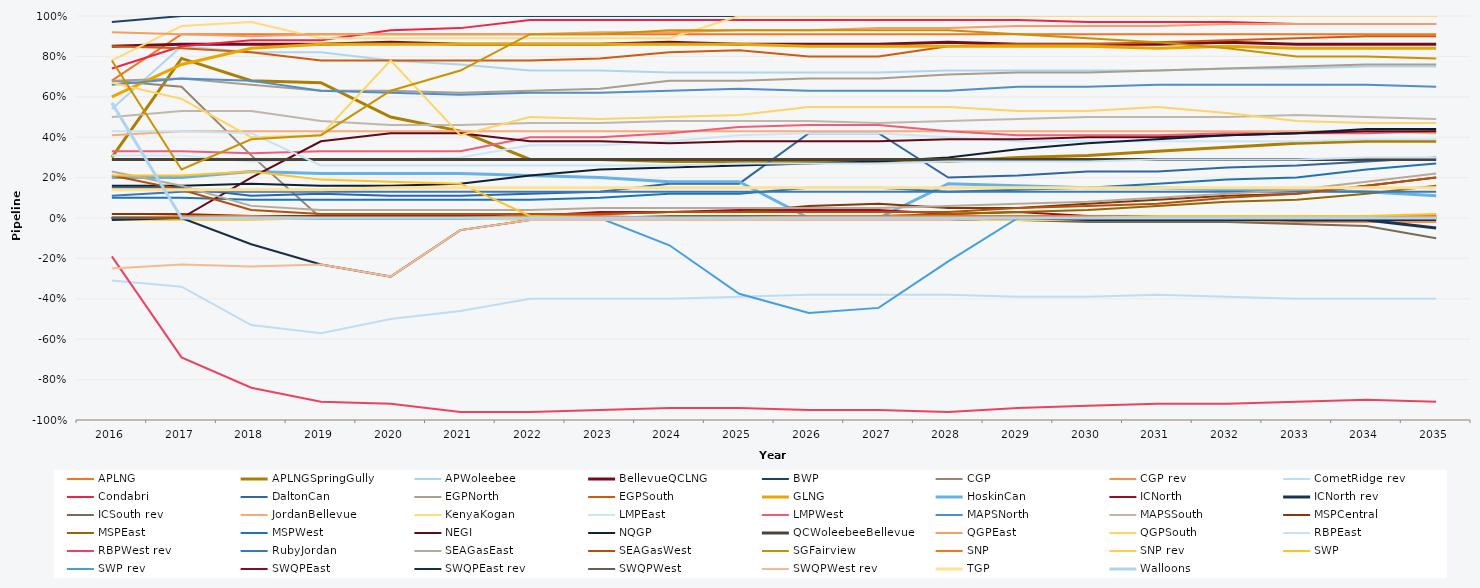
| Category | APLNG | APLNGSpringGully | APWoleebee | BellevueQCLNG | BWP | CGP | CGP rev | CometRidge rev | Condabri | DaltonCan | EGPNorth | EGPSouth | GLNG | HoskinCan | ICNorth | ICNorth rev | ICSouth rev | JordanBellevue | KenyaKogan | LMPEast | LMPWest | MAPSNorth | MAPSSouth | MSPCentral | MSPEast | MSPWest | NEGI | NQGP | QCWoleebeeBellevue | QGPEast | QGPSouth | RBPEast | RBPWest rev | RubyJordan | SEAGasEast | SEAGasWest | SGFairview | SNP | SNP rev | SWP | SWP rev | SWQPEast | SWQPEast rev | SWQPWest | SWQPWest rev | TGP | Walloons |
|---|---|---|---|---|---|---|---|---|---|---|---|---|---|---|---|---|---|---|---|---|---|---|---|---|---|---|---|---|---|---|---|---|---|---|---|---|---|---|---|---|---|---|---|---|---|---|---|
| 2016.0 | 0.68 | 0.3 | 0.54 | 0.85 | 0.97 | 0.68 | 0 | -0.31 | 0.74 | 0.15 | 0.68 | 0.85 | 0.6 | 0.2 | 0 | 0 | 0 | 0.41 | 0.78 | 0.31 | 0.33 | 0.66 | 0.5 | 0.02 | 0 | 0.1 | 0 | 0.16 | 0.29 | 0.92 | 0.67 | 0.43 | -0.19 | 0.11 | 0.23 | 0.21 | 0.78 | 0 | -0.01 | 0.21 | 0 | 0 | -0.01 | 0 | -0.25 | 0.14 | 0.57 |
| 2017.0 | 0.91 | 0.79 | 0.85 | 0.86 | 1 | 0.65 | 0 | -0.34 | 0.85 | 0.15 | 0.69 | 0.84 | 0.76 | 0.2 | 0 | 0 | 0 | 0.43 | 0.95 | 0.31 | 0.33 | 0.69 | 0.53 | 0.02 | 0 | 0.1 | 0 | 0.16 | 0.29 | 0.91 | 0.59 | 0.43 | -0.69 | 0.13 | 0.16 | 0.14 | 0.24 | 0.01 | -0.01 | 0.21 | 0 | 0 | 0 | 0 | -0.23 | 0.14 | 0 |
| 2018.0 | 0.91 | 0.68 | 0.82 | 0.86 | 1 | 0.31 | 0 | -0.53 | 0.88 | 0.11 | 0.66 | 0.82 | 0.84 | 0.23 | 0 | 0 | 0 | 0.43 | 0.97 | 0.28 | 0.32 | 0.68 | 0.53 | 0.01 | 0 | 0.09 | 0.2 | 0.17 | 0.29 | 0.9 | 0.4 | 0.42 | -0.84 | 0.13 | 0.06 | 0.04 | 0.39 | 0.01 | -0.01 | 0.23 | 0 | 0 | -0.13 | 0 | -0.24 | 0.14 | 0 |
| 2019.0 | 0.91 | 0.67 | 0.82 | 0.86 | 1 | 0 | 0 | -0.57 | 0.88 | 0.12 | 0.63 | 0.78 | 0.86 | 0.22 | 0 | 0 | 0 | 0.43 | 0.89 | 0.29 | 0.33 | 0.63 | 0.48 | 0.01 | 0 | 0.09 | 0.38 | 0.16 | 0.29 | 0.91 | 0.41 | 0.26 | -0.91 | 0.13 | 0.04 | 0.02 | 0.41 | 0 | 0 | 0.19 | 0 | 0 | -0.23 | 0 | -0.23 | 0.14 | 0 |
| 2020.0 | 0.91 | 0.5 | 0.78 | 0.87 | 1 | 0 | 0 | -0.5 | 0.93 | 0.11 | 0.63 | 0.78 | 0.86 | 0.22 | 0 | 0 | 0 | 0.43 | 0.89 | 0.29 | 0.33 | 0.62 | 0.46 | 0.01 | 0 | 0.09 | 0.42 | 0.16 | 0.29 | 0.91 | 0.78 | 0.26 | -0.92 | 0.13 | 0.04 | 0.02 | 0.63 | 0 | 0 | 0.18 | 0 | 0 | -0.29 | 0 | -0.29 | 0.15 | 0 |
| 2021.0 | 0.91 | 0.43 | 0.76 | 0.86 | 1 | 0 | 0 | -0.46 | 0.94 | 0.11 | 0.62 | 0.78 | 0.86 | 0.22 | 0 | 0 | 0 | 0.43 | 0.89 | 0.3 | 0.33 | 0.61 | 0.46 | 0.01 | 0 | 0.09 | 0.42 | 0.17 | 0.29 | 0.91 | 0.41 | 0.26 | -0.96 | 0.13 | 0.04 | 0.02 | 0.73 | 0 | 0 | 0.17 | 0 | 0 | -0.06 | 0 | -0.06 | 0.15 | 0 |
| 2022.0 | 0.91 | 0.29 | 0.73 | 0.86 | 1 | 0 | 0 | -0.4 | 0.98 | 0.12 | 0.63 | 0.78 | 0.86 | 0.21 | 0.01 | 0 | 0 | 0.43 | 0.89 | 0.36 | 0.4 | 0.62 | 0.47 | 0.02 | 0 | 0.09 | 0.38 | 0.21 | 0.29 | 0.91 | 0.5 | 0.26 | -0.96 | 0.13 | 0.04 | 0.02 | 0.91 | 0.01 | -0.01 | 0.01 | 0 | 0 | -0.01 | 0 | -0.01 | 0.15 | 0 |
| 2023.0 | 0.91 | 0.29 | 0.73 | 0.86 | 1 | 0 | 0 | -0.4 | 0.98 | 0.13 | 0.64 | 0.79 | 0.86 | 0.2 | 0.03 | 0 | 0 | 0.43 | 0.89 | 0.36 | 0.4 | 0.62 | 0.47 | 0.02 | 0 | 0.1 | 0.38 | 0.24 | 0.29 | 0.92 | 0.49 | 0.26 | -0.95 | 0.13 | 0.05 | 0.02 | 0.91 | 0.01 | -0.01 | 0 | 0 | 0 | -0.01 | 0 | -0.01 | 0.15 | 0 |
| 2024.0 | 0.91 | 0.28 | 0.72 | 0.87 | 1 | 0 | 0 | -0.4 | 0.98 | 0.17 | 0.68 | 0.82 | 0.86 | 0.18 | 0.03 | 0 | 0 | 0.43 | 0.89 | 0.38 | 0.42 | 0.63 | 0.48 | 0.03 | 0.01 | 0.12 | 0.37 | 0.25 | 0.29 | 0.92 | 0.5 | 0.26 | -0.94 | 0.13 | 0.05 | 0.03 | 0.93 | 0 | 0 | 0 | -0.135 | 0 | -0.01 | 0 | -0.01 | 0.15 | 0 |
| 2025.0 | 0.91 | 0.28 | 0.72 | 0.86 | 1 | 0 | 0 | -0.39 | 0.98 | 0.17 | 0.68 | 0.83 | 0.86 | 0.18 | 0.04 | 0 | 0 | 0.43 | 1 | 0.41 | 0.45 | 0.64 | 0.48 | 0.03 | 0.01 | 0.12 | 0.38 | 0.26 | 0.29 | 0.93 | 0.51 | 0.27 | -0.94 | 0.13 | 0.05 | 0.03 | 0.93 | 0 | 0 | 0 | -0.375 | 0 | -0.01 | 0 | -0.01 | 0.15 | 0 |
| 2026.0 | 0.91 | 0.28 | 0.72 | 0.86 | 1 | 0 | 0 | -0.38 | 0.98 | 0.42 | 0.69 | 0.8 | 0.85 | 0 | 0.04 | 0 | 0 | 0.43 | 1 | 0.42 | 0.46 | 0.63 | 0.48 | 0.06 | 0.01 | 0.15 | 0.38 | 0.27 | 0.29 | 0.93 | 0.55 | 0.27 | -0.95 | 0.13 | 0.05 | 0.03 | 0.93 | 0.01 | -0.01 | 0 | -0.47 | 0 | -0.01 | 0 | -0.01 | 0.15 | 0 |
| 2027.0 | 0.91 | 0.28 | 0.72 | 0.86 | 1 | 0 | 0 | -0.38 | 0.98 | 0.42 | 0.69 | 0.8 | 0.85 | 0 | 0.04 | 0 | 0 | 0.43 | 1 | 0.42 | 0.46 | 0.63 | 0.47 | 0.07 | 0.01 | 0.15 | 0.38 | 0.28 | 0.29 | 0.94 | 0.55 | 0.27 | -0.95 | 0.13 | 0.05 | 0.03 | 0.93 | 0.01 | -0.01 | 0 | -0.445 | 0 | 0 | 0 | -0.01 | 0.15 | 0 |
| 2028.0 | 0.91 | 0.28 | 0.73 | 0.87 | 1 | 0 | 0 | -0.38 | 0.98 | 0.2 | 0.71 | 0.85 | 0.85 | 0.17 | 0.02 | 0 | -0.01 | 0.43 | 1 | 0.4 | 0.43 | 0.63 | 0.48 | 0.05 | 0.02 | 0.13 | 0.39 | 0.3 | 0.29 | 0.94 | 0.55 | 0.28 | -0.96 | 0.13 | 0.06 | 0.03 | 0.93 | 0.01 | -0.01 | 0 | -0.215 | 0 | -0.01 | 0 | -0.01 | 0.15 | 0 |
| 2029.0 | 0.91 | 0.3 | 0.73 | 0.86 | 1 | 0 | 0 | -0.39 | 0.98 | 0.21 | 0.72 | 0.86 | 0.85 | 0.16 | 0.03 | 0 | -0.01 | 0.43 | 1 | 0.38 | 0.41 | 0.65 | 0.49 | 0.05 | 0.03 | 0.14 | 0.39 | 0.34 | 0.29 | 0.95 | 0.53 | 0.28 | -0.94 | 0.13 | 0.07 | 0.05 | 0.91 | 0.01 | -0.01 | 0 | 0 | 0 | 0 | 0 | 0 | 0.15 | 0 |
| 2030.0 | 0.91 | 0.31 | 0.73 | 0.86 | 1 | 0 | -0.01 | -0.39 | 0.97 | 0.23 | 0.72 | 0.86 | 0.85 | 0.15 | 0.01 | 0 | -0.02 | 0.43 | 1 | 0.38 | 0.41 | 0.65 | 0.5 | 0.07 | 0.04 | 0.15 | 0.4 | 0.37 | 0.29 | 0.95 | 0.53 | 0.28 | -0.93 | 0.13 | 0.08 | 0.06 | 0.89 | 0.01 | -0.01 | 0 | 0 | 0 | -0.01 | 0 | 0 | 0.15 | 0 |
| 2031.0 | 0.91 | 0.33 | 0.73 | 0.86 | 1 | 0 | -0.01 | -0.38 | 0.97 | 0.23 | 0.73 | 0.87 | 0.84 | 0.15 | 0.01 | 0 | -0.02 | 0.43 | 1 | 0.38 | 0.41 | 0.66 | 0.5 | 0.09 | 0.06 | 0.17 | 0.4 | 0.39 | 0.29 | 0.95 | 0.55 | 0.29 | -0.92 | 0.13 | 0.1 | 0.07 | 0.87 | 0.01 | -0.01 | 0.01 | 0 | 0 | -0.01 | 0 | 0 | 0.15 | 0 |
| 2032.0 | 0.91 | 0.35 | 0.74 | 0.87 | 1 | 0 | -0.02 | -0.39 | 0.97 | 0.25 | 0.74 | 0.88 | 0.85 | 0.14 | 0.01 | 0 | -0.02 | 0.43 | 1 | 0.38 | 0.42 | 0.66 | 0.5 | 0.11 | 0.08 | 0.19 | 0.41 | 0.41 | 0.29 | 0.96 | 0.52 | 0.29 | -0.92 | 0.13 | 0.12 | 0.1 | 0.84 | 0.01 | -0.01 | 0.01 | 0 | 0 | -0.01 | 0 | 0 | 0.15 | 0 |
| 2033.0 | 0.91 | 0.37 | 0.74 | 0.86 | 1 | 0 | -0.02 | -0.4 | 0.96 | 0.26 | 0.75 | 0.89 | 0.84 | 0.14 | 0.01 | -0.01 | -0.03 | 0.43 | 1 | 0.38 | 0.42 | 0.66 | 0.51 | 0.12 | 0.09 | 0.2 | 0.42 | 0.42 | 0.29 | 0.96 | 0.48 | 0.29 | -0.91 | 0.13 | 0.14 | 0.12 | 0.8 | 0.01 | -0.01 | 0.01 | 0 | 0 | -0.01 | 0 | 0 | 0.15 | 0 |
| 2034.0 | 0.91 | 0.38 | 0.75 | 0.86 | 1 | 0 | -0.02 | -0.4 | 0.96 | 0.28 | 0.76 | 0.9 | 0.84 | 0.13 | 0 | -0.01 | -0.04 | 0.43 | 1 | 0.39 | 0.42 | 0.66 | 0.5 | 0.16 | 0.12 | 0.24 | 0.43 | 0.44 | 0.29 | 0.96 | 0.47 | 0.3 | -0.9 | 0.13 | 0.18 | 0.16 | 0.8 | 0.01 | -0.01 | 0.01 | 0 | 0 | -0.01 | 0 | 0 | 0.15 | 0 |
| 2035.0 | 0.91 | 0.38 | 0.75 | 0.86 | 1 | 0 | -0.02 | -0.4 | 0.96 | 0.3 | 0.76 | 0.9 | 0.84 | 0.11 | 0.01 | -0.05 | -0.1 | 0.42 | 1 | 0.39 | 0.43 | 0.65 | 0.49 | 0.2 | 0.16 | 0.27 | 0.43 | 0.44 | 0.29 | 0.96 | 0.47 | 0.3 | -0.91 | 0.13 | 0.22 | 0.2 | 0.79 | 0.01 | -0.01 | 0.02 | 0 | 0 | -0.01 | 0 | 0 | 0.15 | 0 |